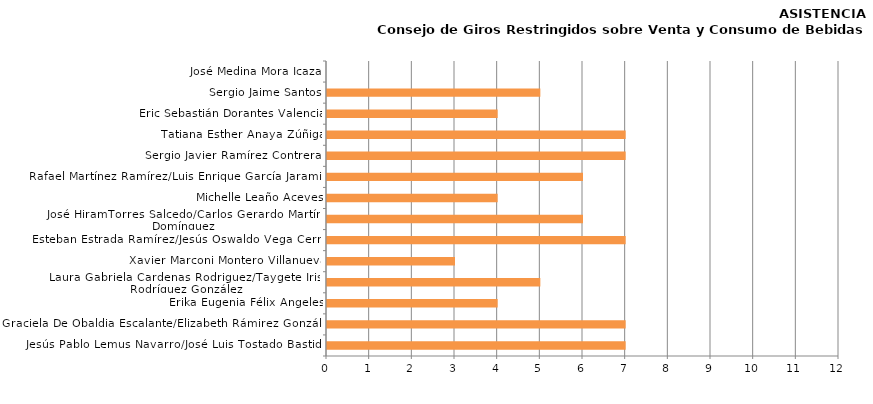
| Category | Series 0 |
|---|---|
| Jesús Pablo Lemus Navarro/José Luis Tostado Bastidas | 7 |
| Graciela De Obaldia Escalante/Elizabeth Rámirez González | 7 |
| Erika Eugenia Félix Ángeles | 4 |
| Laura Gabriela Cardenas Rodriguez/Taygete Irisay Rodríguez González | 5 |
| Xavier Marconi Montero Villanueva | 3 |
| Esteban Estrada Ramírez/Jesús Oswaldo Vega Cerros | 7 |
| José HiramTorres Salcedo/Carlos Gerardo Martínez Domínguez | 6 |
|  Michelle Leaño Aceves | 4 |
| Rafael Martínez Ramírez/Luis Enrique García Jaramillo | 6 |
| Sergio Javier Ramírez Contreras | 7 |
| Tatiana Esther Anaya Zúñiga | 7 |
| Eric Sebastián Dorantes Valencia | 4 |
| Sergio Jaime Santos | 5 |
| José Medina Mora Icaza | 0 |